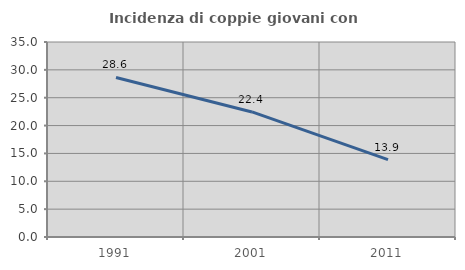
| Category | Incidenza di coppie giovani con figli |
|---|---|
| 1991.0 | 28.635 |
| 2001.0 | 22.444 |
| 2011.0 | 13.897 |